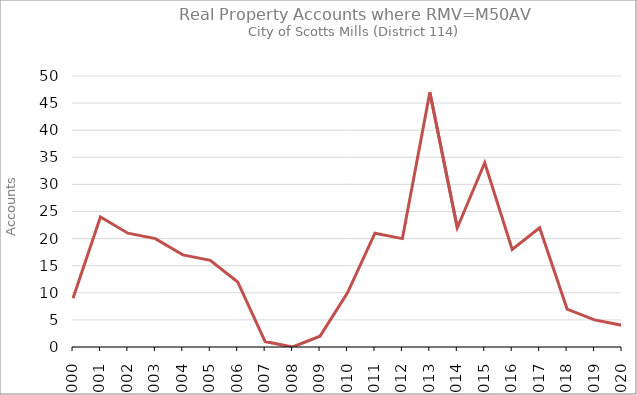
| Category | Series 0 |
|---|---|
| 2000.0 | 9 |
| 2001.0 | 24 |
| 2002.0 | 21 |
| 2003.0 | 20 |
| 2004.0 | 17 |
| 2005.0 | 16 |
| 2006.0 | 12 |
| 2007.0 | 1 |
| 2008.0 | 0 |
| 2009.0 | 2 |
| 2010.0 | 10 |
| 2011.0 | 21 |
| 2012.0 | 20 |
| 2013.0 | 47 |
| 2014.0 | 22 |
| 2015.0 | 34 |
| 2016.0 | 18 |
| 2017.0 | 22 |
| 2018.0 | 7 |
| 2019.0 | 5 |
| 2020.0 | 4 |